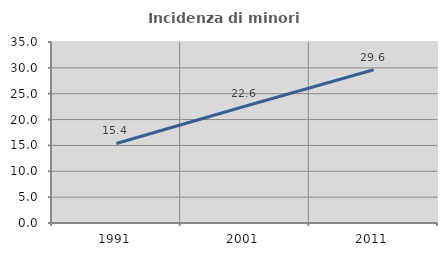
| Category | Incidenza di minori stranieri |
|---|---|
| 1991.0 | 15.385 |
| 2001.0 | 22.581 |
| 2011.0 | 29.621 |